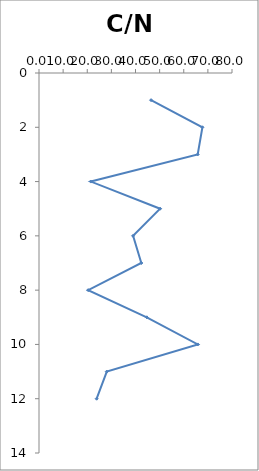
| Category | C/N molar |
|---|---|
| 46.460641072487306 | 1 |
| 67.73890952006465 | 2 |
| 65.7806660130566 | 3 |
| 21.489452014165092 | 4 |
| 50.19950620554001 | 5 |
| 39.00324089209231 | 6 |
| 42.403034522899254 | 7 |
| 20.379697159310343 | 8 |
| 44.673162121930645 | 9 |
| 65.82075463941769 | 10 |
| 28.1016352508654 | 11 |
| 23.892912450683855 | 12 |